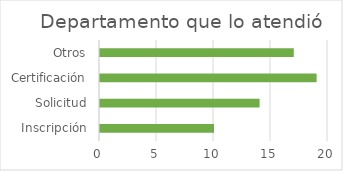
| Category | Series 0 |
|---|---|
| Inscripción | 10 |
| Solicitud | 14 |
| Certificación | 19 |
| Otros | 17 |